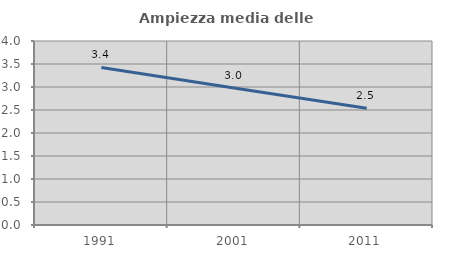
| Category | Ampiezza media delle famiglie |
|---|---|
| 1991.0 | 3.424 |
| 2001.0 | 2.98 |
| 2011.0 | 2.54 |